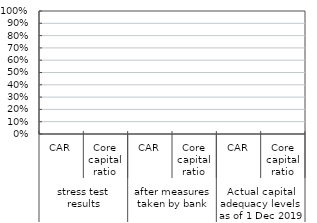
| Category | Series 0 |
|---|---|
| 0 | 0 |
| 1900-01-01 | 0 |
| 1900-01-02 | 0 |
| 1900-01-03 | 0 |
| 1900-01-04 | 0 |
| 1900-01-05 | 0 |